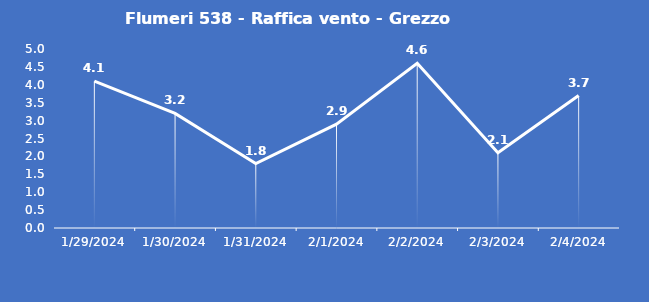
| Category | Flumeri 538 - Raffica vento - Grezzo (m/s) |
|---|---|
| 1/29/24 | 4.1 |
| 1/30/24 | 3.2 |
| 1/31/24 | 1.8 |
| 2/1/24 | 2.9 |
| 2/2/24 | 4.6 |
| 2/3/24 | 2.1 |
| 2/4/24 | 3.7 |